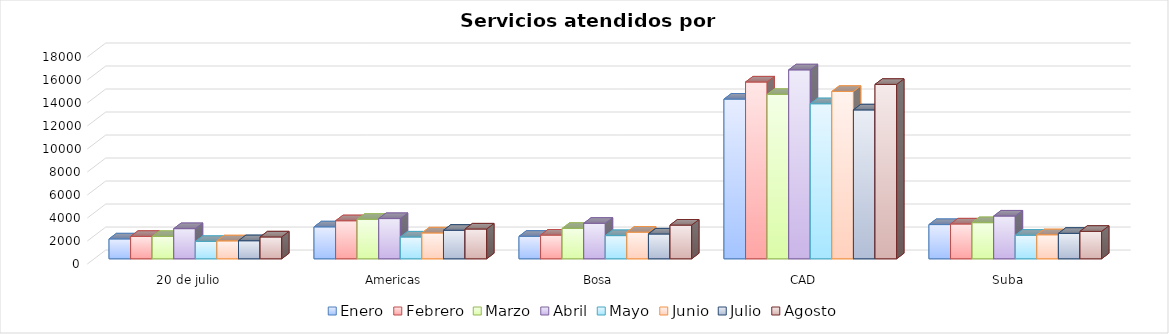
| Category | Enero | Febrero | Marzo | Abril | Mayo | Junio | Julio | Agosto |
|---|---|---|---|---|---|---|---|---|
| 20 de julio | 1728 | 1945 | 1938 | 2622 | 1506 | 1559 | 1570 | 1900 |
| Americas | 2775 | 3308 | 3423 | 3497 | 1894 | 2249 | 2479 | 2590 |
| Bosa | 1953 | 2061 | 2641 | 3084 | 2016 | 2317 | 2157 | 2930 |
| CAD | 13884 | 15370 | 14286 | 16426 | 13480 | 14550 | 12945 | 15161 |
| Suba | 2975 | 3028 | 3141 | 3717 | 2048 | 2088 | 2211 | 2386 |